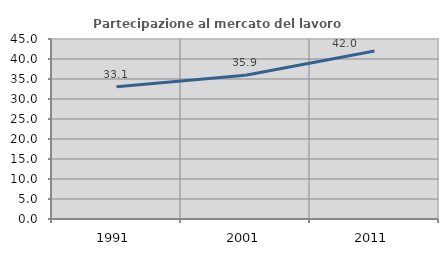
| Category | Partecipazione al mercato del lavoro  femminile |
|---|---|
| 1991.0 | 33.084 |
| 2001.0 | 35.938 |
| 2011.0 | 42.022 |